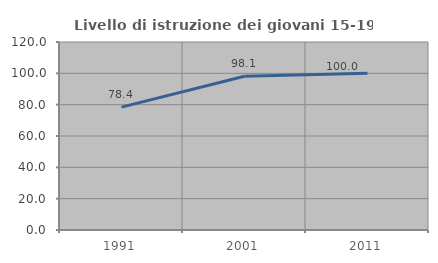
| Category | Livello di istruzione dei giovani 15-19 anni |
|---|---|
| 1991.0 | 78.409 |
| 2001.0 | 98.113 |
| 2011.0 | 100 |